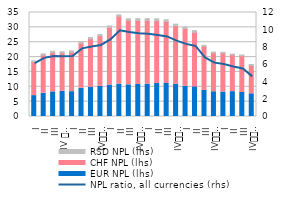
| Category | EUR NPL (lhs) | CHF NPL (lhs) | RSD NPL (lhs) |
|---|---|---|---|
| I | 7.031 | 11.315 | 0.376 |
| II | 7.838 | 12.854 | 0.398 |
| III | 8.287 | 13.256 | 0.398 |
| IV 
2013 | 8.472 | 12.907 | 0.424 |
| I | 8.364 | 13.289 | 0.434 |
| II | 9.502 | 15.183 | 0.445 |
| III | 9.861 | 16.293 | 0.431 |
| IV
2014 | 10.2 | 16.966 | 0.464 |
| I | 10.588 | 19.402 | 0.479 |
| II | 10.907 | 22.828 | 0.467 |
| III | 10.661 | 21.759 | 0.479 |
| IV
2015 | 10.774 | 21.561 | 0.595 |
| I | 10.906 | 21.449 | 0.603 |
| II | 11.118 | 21.151 | 0.6 |
| III | 11.109 | 20.882 | 0.585 |
| IV
2016 | 10.82 | 19.717 | 0.539 |
| I | 10.204 | 19.386 | 0.539 |
| II | 10.002 | 18.325 | 0.564 |
| III | 8.771 | 14.875 | 0.29 |
| IV
2017 | 8.337 | 13.073 | 0.274 |
| I | 8.247 | 13.09 | 0.266 |
| II | 8.373 | 12.384 | 0.241 |
| III | 8.081 | 12.357 | 0.265 |
| IV
2018 | 7.649 | 9.577 | 0.27 |